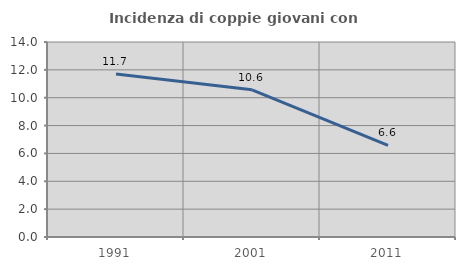
| Category | Incidenza di coppie giovani con figli |
|---|---|
| 1991.0 | 11.704 |
| 2001.0 | 10.568 |
| 2011.0 | 6.577 |